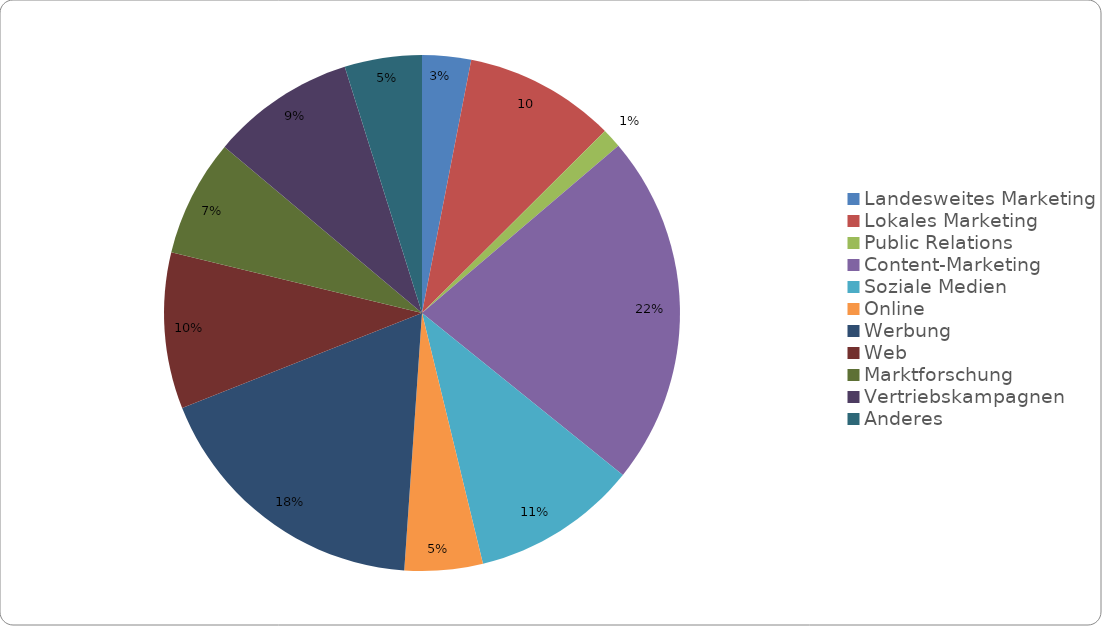
| Category | Series 0 |
|---|---|
| Landesweites Marketing | 2000 |
| Lokales Marketing | 6200 |
| Public Relations | 800 |
| Content-Marketing | 14400 |
| Soziale Medien | 6800 |
| Online | 3200 |
| Werbung | 11700 |
| Web | 6400 |
| Marktforschung | 4800 |
| Vertriebskampagnen | 5900 |
| Anderes | 3165 |